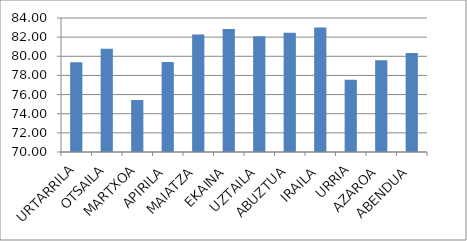
| Category | Series 0 |
|---|---|
| URTARRILA | 79.387 |
| OTSAILA | 80.792 |
| MARTXOA | 75.435 |
| APIRILA | 79.411 |
| MAIATZA | 82.274 |
| EKAINA | 82.843 |
| UZTAILA | 82.086 |
| ABUZTUA | 82.468 |
| IRAILA | 83 |
| URRIA | 77.543 |
| AZAROA | 79.578 |
| ABENDUA | 80.339 |